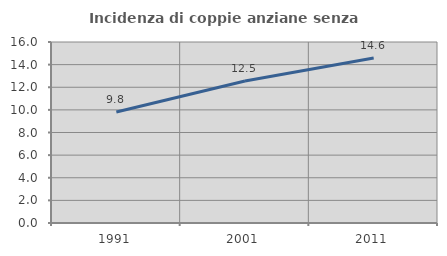
| Category | Incidenza di coppie anziane senza figli  |
|---|---|
| 1991.0 | 9.805 |
| 2001.0 | 12.548 |
| 2011.0 | 14.591 |